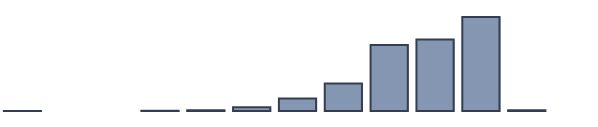
| Category | Series 0 |
|---|---|
| 0 | 0.043 |
| 1 | 0 |
| 2 | 0 |
| 3 | 0.087 |
| 4 | 0.304 |
| 5 | 1.391 |
| 6 | 4.522 |
| 7 | 9.913 |
| 8 | 23.739 |
| 9 | 25.783 |
| 10 | 33.913 |
| 11 | 0.304 |
| 12 | 0 |